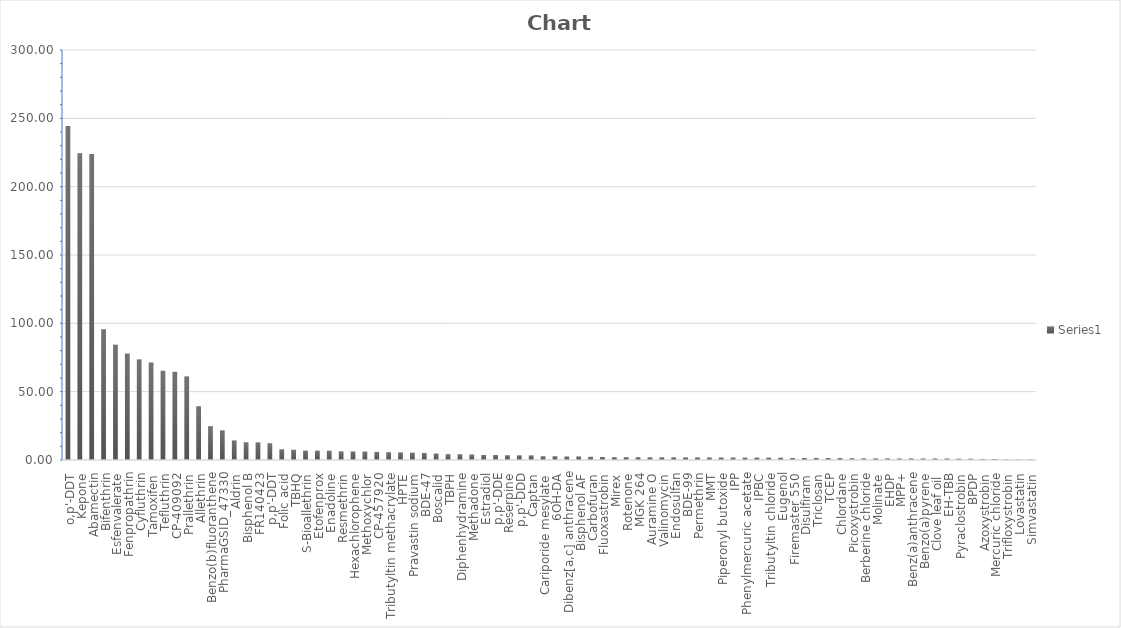
| Category | Series 0 |
|---|---|
| o,p'-DDT | 244.398 |
| Kepone | 224.375 |
| Abamectin | 223.938 |
| Bifenthrin | 95.737 |
| Esfenvalerate | 84.352 |
| Fenpropathrin | 77.888 |
| Cyfluthrin | 73.653 |
| Tamoxifen | 71.291 |
| Tefluthrin | 65.292 |
| CP-409092 | 64.511 |
| Prallethrin | 61.191 |
| Allethrin | 39.351 |
| Benzo(b)fluoranthene | 24.753 |
| PharmaGSID_47330 | 21.719 |
| Aldrin | 14.345 |
| Bisphenol B | 12.988 |
| FR140423 | 12.925 |
| p,p'-DDT | 12.27 |
| Folic acid | 7.841 |
| TBHQ | 7.474 |
| S-Bioallethrin | 6.828 |
| Etofenprox | 6.812 |
| Enadoline | 6.763 |
| Resmethrin | 6.345 |
| Hexachlorophene | 6.265 |
| Methoxychlor | 6.158 |
| CP-457920 | 5.919 |
| Tributyltin methacrylate | 5.711 |
| HPTE | 5.577 |
| Pravastin sodium | 5.327 |
| BDE-47 | 5.137 |
| Boscalid | 4.695 |
| TBPH | 4.26 |
| Diphenhydramine | 4.223 |
| Methadone | 3.966 |
| Estradiol | 3.684 |
| p,p'-DDE | 3.642 |
| Reserpine | 3.48 |
| p,p'-DDD | 3.432 |
| Captan | 3.399 |
| Cariporide mesylate | 2.762 |
| 6OH-DA | 2.761 |
| Dibenz[a,c] anthracene | 2.582 |
| Bisphenol AF | 2.549 |
| Carbofuran | 2.338 |
| Fluoxastrobin | 2.234 |
| Mirex | 2.058 |
| Rotenone | 2.049 |
| MGK 264 | 2.031 |
| Auramine O | 1.985 |
| Valinomycin | 1.97 |
| Endosulfan | 1.964 |
| BDE-99 | 1.916 |
| Permethrin | 1.887 |
| MMT | 1.796 |
| Piperonyl butoxide | 1.771 |
| IPP | 1.758 |
| Phenylmercuric acetate | 1.713 |
| IPBC | 1.694 |
| Tributyltin chloride | 1.683 |
| Eugenol | 1.641 |
| Firemaster 550 | 1.481 |
| Disulfiram | 1.469 |
| Triclosan | 1.46 |
| TCEP | 1.426 |
| Chlordane | 1.419 |
| Picoxystrobin | 1.287 |
| Berberine chloride | 1.22 |
| Molinate | 1.207 |
| EHDP | 1.175 |
| MPP+ | 1.137 |
| Benz(a)anthracene | 1.092 |
| Benzo(a)pyrene | 1.087 |
| Clove leaf oil | 1.065 |
| EH-TBB | 1.047 |
| Pyraclostrobin | 0.913 |
| BPDP | 0.913 |
| Azoxystrobin | 0.776 |
| Mercuric chloride | 0.726 |
| Trifloxystrobin | 0.469 |
| Lovastatin | 0.381 |
| Simvastatin | 0.359 |